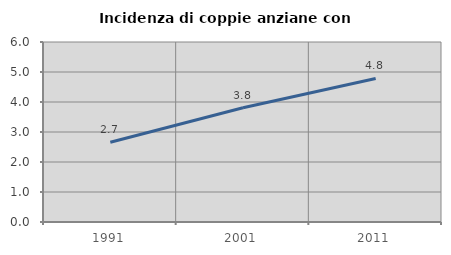
| Category | Incidenza di coppie anziane con figli |
|---|---|
| 1991.0 | 2.66 |
| 2001.0 | 3.807 |
| 2011.0 | 4.785 |